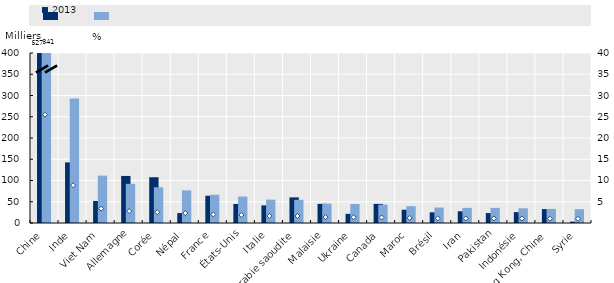
| Category | 2013 | 2019 |
|---|---|---|
| Chine | 627.416 | 840.871 |
| Inde | 142.603 | 293.12 |
| Viet Nam | 51.801 | 111.502 |
| Allemagne | 110.735 | 92.189 |
| Corée | 107.637 | 84.046 |
| Népal | 23.354 | 76.749 |
| France | 64.083 | 66.432 |
| États-Unis | 44.782 | 62.172 |
| Italie | 41.461 | 54.978 |
| Arabie saoudite | 60.254 | 54.524 |
| Malaisie | 45.008 | 45.477 |
| Ukraine | 21.509 | 44.698 |
| Canada | 44.932 | 43.131 |
| Maroc | 31.179 | 39.581 |
| Brésil | 25.136 | 36.33 |
| Iran | 27.615 | 35.601 |
| Pakistan | 23.394 | 35.554 |
| Indonésie | 25.567 | 34.632 |
| Hong Kong, Chine | 32.763 | 33.144 |
| Syrie | 3.241 | 32.533 |